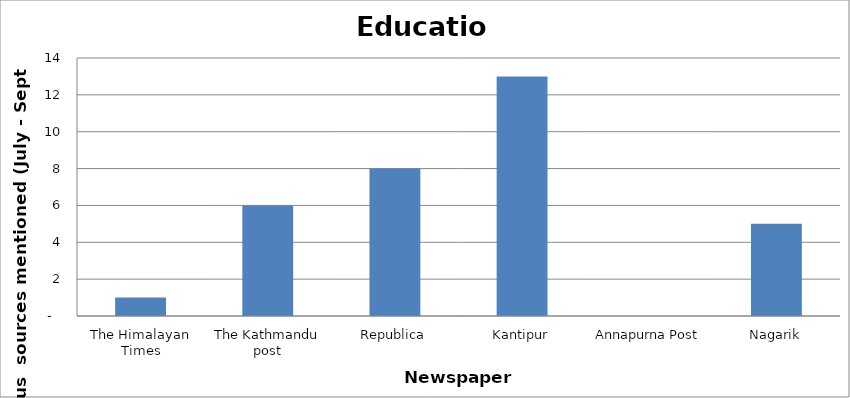
| Category | Education |
|---|---|
| The Himalayan Times | 1 |
| The Kathmandu post | 6 |
| Republica | 8 |
| Kantipur | 13 |
| Annapurna Post | 0 |
| Nagarik | 5 |